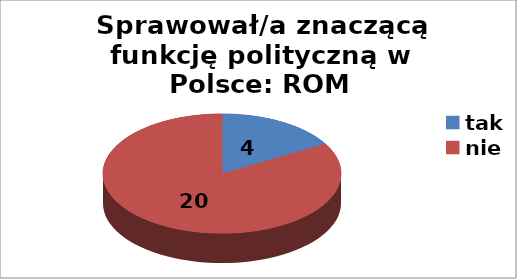
| Category | Series 0 |
|---|---|
| tak | 4 |
| nie | 20 |